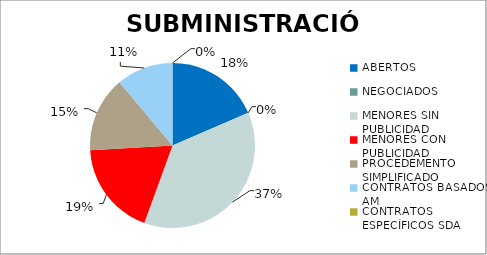
| Category | Series 0 |
|---|---|
| ABERTOS  | 0.185 |
| NEGOCIADOS  | 0 |
| MENORES SIN PUBLICIDAD | 0.37 |
| MENORES CON PUBLICIDAD | 0.185 |
| PROCEDEMENTO SIMPLIFICADO | 0.148 |
| CONTRATOS BASADOS AM | 0.111 |
| CONTRATOS ESPECÍFICOS SDA | 0 |